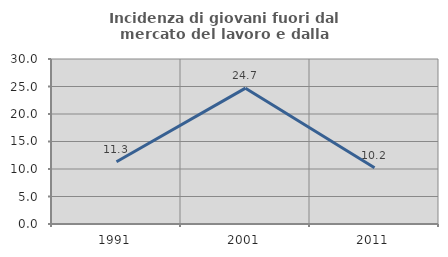
| Category | Incidenza di giovani fuori dal mercato del lavoro e dalla formazione  |
|---|---|
| 1991.0 | 11.321 |
| 2001.0 | 24.697 |
| 2011.0 | 10.241 |